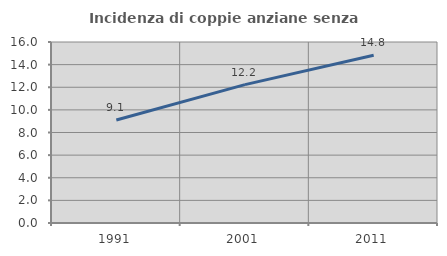
| Category | Incidenza di coppie anziane senza figli  |
|---|---|
| 1991.0 | 9.107 |
| 2001.0 | 12.229 |
| 2011.0 | 14.831 |